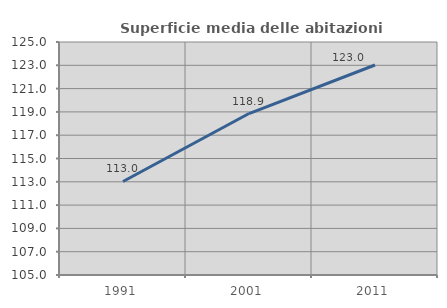
| Category | Superficie media delle abitazioni occupate |
|---|---|
| 1991.0 | 113.027 |
| 2001.0 | 118.859 |
| 2011.0 | 123.024 |